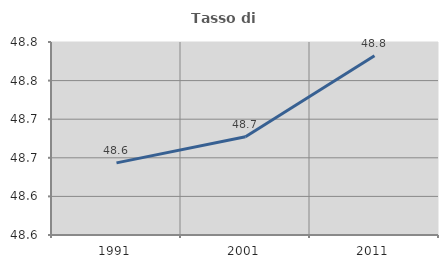
| Category | Tasso di occupazione   |
|---|---|
| 1991.0 | 48.643 |
| 2001.0 | 48.677 |
| 2011.0 | 48.782 |